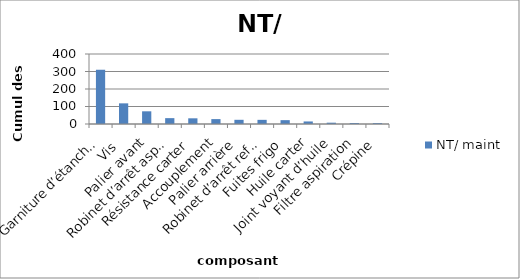
| Category | NT/ maint |
|---|---|
| Garniture d’étanchéité | 310 |
| Vis  | 118 |
| Palier avant | 72.5 |
| Robinet d’arrêt aspiration | 33.5 |
| Résistance carter | 32.5 |
| Accouplement | 28 |
| Palier arrière | 24 |
| Robinet d’arrêt refoulement | 23.75 |
| Fuites frigo | 22 |
| Huile carter | 14.5 |
| Joint voyant d’huile | 7.5 |
| Filtre aspiration | 5.5 |
| Crépine | 5 |